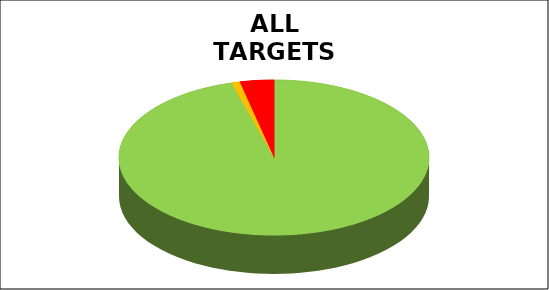
| Category | Series 0 |
|---|---|
| Green | 0.956 |
| Amber | 0.009 |
| Red | 0.035 |